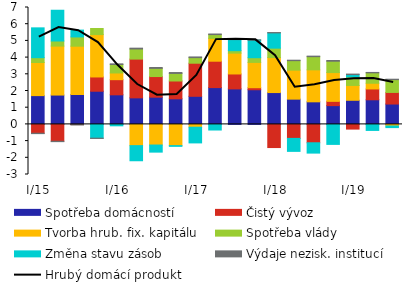
| Category | Spotřeba domácností  | Čistý vývoz  | Tvorba hrub. fix. kapitálu | Spotřeba vlády | Změna stavu zásob  | Výdaje nezisk. institucí |
|---|---|---|---|---|---|---|
|  I/15 | 1.723 | -0.53 | 1.984 | 0.288 | 1.786 | -0.023 |
| II | 1.757 | -1.01 | 2.932 | 0.304 | 1.842 | -0.022 |
| III | 1.791 | -0.012 | 2.892 | 0.554 | 0.408 | -0.021 |
| IV | 1.986 | 0.854 | 2.539 | 0.364 | -0.825 | -0.016 |
|  I/16 | 1.771 | 0.907 | 0.401 | 0.508 | -0.085 | 0.038 |
| II | 1.59 | 2.32 | -1.272 | 0.607 | -0.905 | 0.048 |
| III | 1.631 | 1.235 | -1.236 | 0.489 | -0.424 | 0.051 |
| IV | 1.532 | 1.067 | -1.271 | 0.454 | -0.044 | 0.052 |
|  I/17 | 1.683 | 1.981 | -0.168 | 0.334 | -0.94 | 0.042 |
| II | 2.204 | 1.58 | 1.37 | 0.224 | -0.336 | 0.035 |
| III | 2.125 | 0.894 | 1.248 | 0.147 | 0.663 | 0.027 |
| IV | 2.075 | 0.121 | 1.516 | 0.282 | 1.052 | 0.017 |
|  I/18 | 1.907 | -1.386 | 2.096 | 0.563 | 0.913 | 0.02 |
| II | 1.512 | -0.838 | 1.737 | 0.568 | -0.778 | 0.026 |
| III | 1.352 | -1.1 | 1.915 | 0.788 | -0.619 | 0.032 |
| IV | 1.124 | 0.256 | 1.725 | 0.679 | -1.197 | 0.043 |
|  I/19 | 1.444 | -0.281 | 0.888 | 0.51 | 0.142 | 0.03 |
| II | 1.474 | 0.648 | 0.343 | 0.624 | -0.361 | 0.024 |
| III | 1.22 | 0.694 | -0.095 | 0.767 | -0.097 | 0.024 |